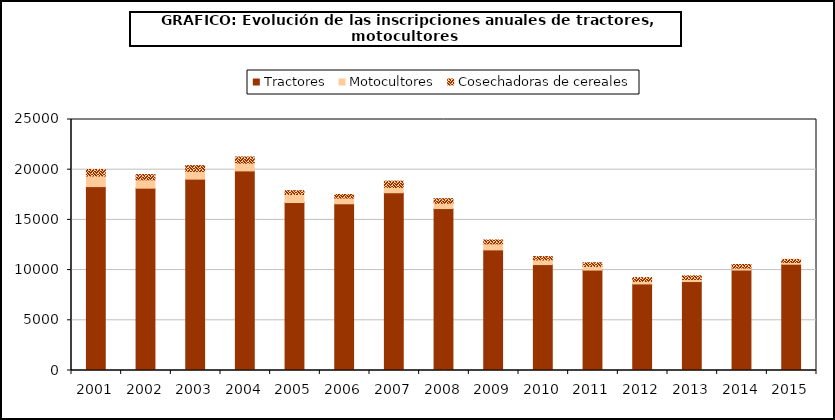
| Category | Tractores | Motocultores | Cosechadoras de cereales |
|---|---|---|---|
| 2001.0 | 18314 | 1057 | 649 |
| 2002.0 | 18162 | 830 | 525 |
| 2003.0 | 19060 | 766 | 581 |
| 2004.0 | 19881 | 769 | 620 |
| 2005.0 | 16729 | 800 | 381 |
| 2006.0 | 16605 | 570 | 361 |
| 2007.0 | 17706 | 525 | 630 |
| 2008.0 | 16129 | 525 | 463 |
| 2009.0 | 12013 | 603 | 384 |
| 2010.0 | 10548 | 463 | 336 |
| 2011.0 | 10002 | 366 | 362 |
| 2012.0 | 8623 | 252 | 380 |
| 2013.0 | 8859 | 208 | 361 |
| 2014.0 | 10004 | 196 | 360 |
| 2015.0 | 10587 | 175 | 305 |